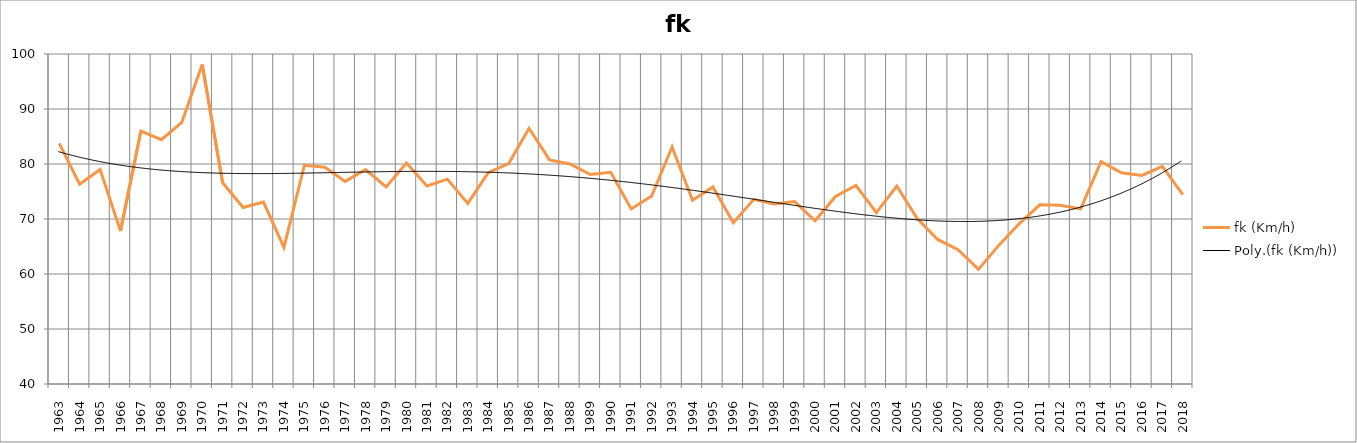
| Category | fk (Km/h) |
|---|---|
| 1963.0 | 83.75 |
| 1964.0 | 76.333 |
| 1965.0 | 79 |
| 1966.0 | 67.833 |
| 1967.0 | 86 |
| 1968.0 | 84.417 |
| 1969.0 | 87.583 |
| 1970.0 | 98.083 |
| 1971.0 | 76.583 |
| 1972.0 | 72.083 |
| 1973.0 | 73.083 |
| 1974.0 | 64.833 |
| 1975.0 | 79.75 |
| 1976.0 | 79.417 |
| 1977.0 | 76.833 |
| 1978.0 | 79 |
| 1979.0 | 75.833 |
| 1980.0 | 80.167 |
| 1981.0 | 76 |
| 1982.0 | 77.25 |
| 1983.0 | 72.833 |
| 1984.0 | 78.417 |
| 1985.0 | 80.083 |
| 1986.0 | 86.5 |
| 1987.0 | 80.75 |
| 1988.0 | 80 |
| 1989.0 | 78.083 |
| 1990.0 | 78.5 |
| 1991.0 | 71.833 |
| 1992.0 | 74.182 |
| 1993.0 | 83.083 |
| 1994.0 | 73.417 |
| 1995.0 | 75.833 |
| 1996.0 | 69.333 |
| 1997.0 | 73.583 |
| 1998.0 | 72.75 |
| 1999.0 | 73.167 |
| 2000.0 | 69.667 |
| 2001.0 | 74.083 |
| 2002.0 | 76.091 |
| 2003.0 | 71.167 |
| 2004.0 | 76 |
| 2005.0 | 70.1 |
| 2006.0 | 66.286 |
| 2007.0 | 64.429 |
| 2008.0 | 60.833 |
| 2009.0 | 65.25 |
| 2010.0 | 69.167 |
| 2011.0 | 72.583 |
| 2012.0 | 72.5 |
| 2013.0 | 71.833 |
| 2014.0 | 80.417 |
| 2015.0 | 78.417 |
| 2016.0 | 77.917 |
| 2017.0 | 79.583 |
| 2018.0 | 74.417 |